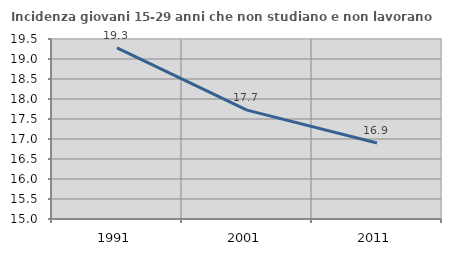
| Category | Incidenza giovani 15-29 anni che non studiano e non lavorano  |
|---|---|
| 1991.0 | 19.277 |
| 2001.0 | 17.722 |
| 2011.0 | 16.901 |